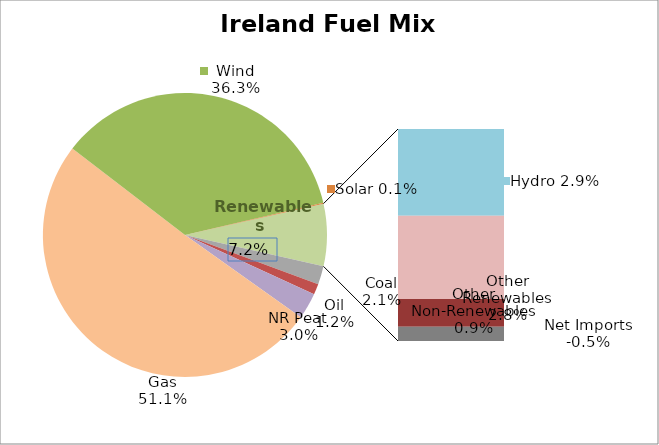
| Category | Series 0 |
|---|---|
| Coal | 0.021 |
| Oil | 0.012 |
| NR Peat | 0.03 |
| Gas | 0.511 |
| Wind | 0.363 |
| Solar | 0.001 |
| Hydro | 0.029 |
| Other Renewables | 0.028 |
| Other Non-Renewables | 0.009 |
| Net Imports | -0.005 |